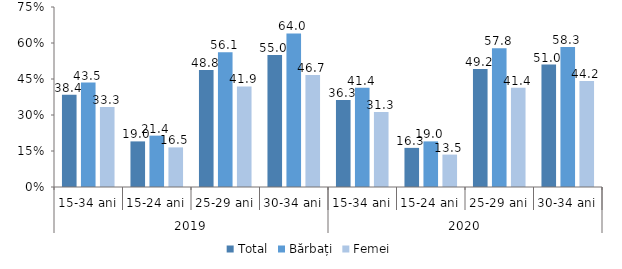
| Category | Total | Bărbați | Femei |
|---|---|---|---|
| 0 | 38.4 | 43.5 | 33.3 |
| 1 | 19 | 21.4 | 16.5 |
| 2 | 48.8 | 56.1 | 41.9 |
| 3 | 55 | 64 | 46.7 |
| 4 | 36.3 | 41.4 | 31.3 |
| 5 | 16.3 | 19 | 13.5 |
| 6 | 49.2 | 57.8 | 41.4 |
| 7 | 51 | 58.3 | 44.2 |